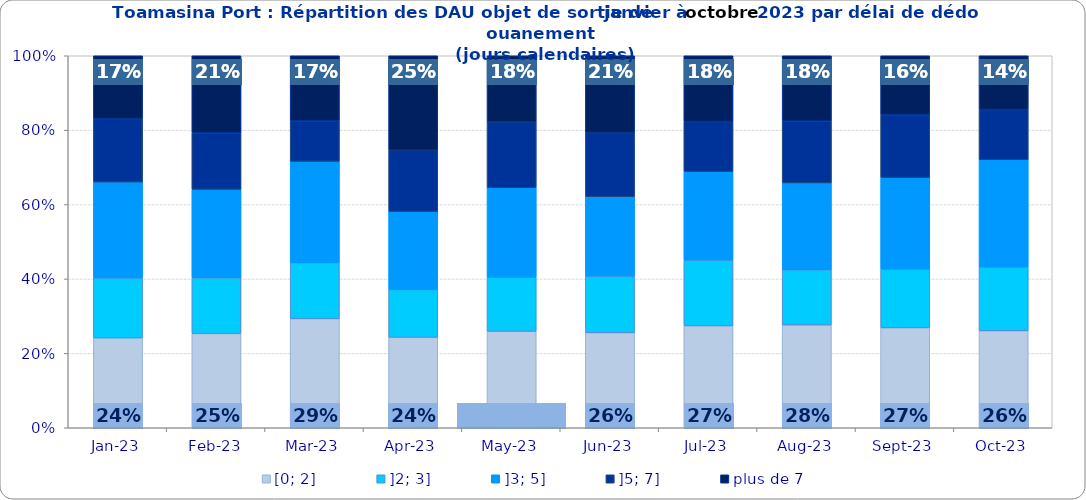
| Category | [0; 2] | ]2; 3] | ]3; 5] | ]5; 7] | plus de 7 |
|---|---|---|---|---|---|
| 2023-01-01 | 0.242 | 0.161 | 0.258 | 0.171 | 0.169 |
| 2023-02-01 | 0.253 | 0.15 | 0.238 | 0.152 | 0.207 |
| 2023-03-01 | 0.293 | 0.151 | 0.272 | 0.109 | 0.175 |
| 2023-04-01 | 0.243 | 0.129 | 0.209 | 0.165 | 0.254 |
| 2023-05-01 | 0.259 | 0.146 | 0.24 | 0.178 | 0.177 |
| 2023-06-01 | 0.255 | 0.152 | 0.213 | 0.173 | 0.206 |
| 2023-07-01 | 0.274 | 0.177 | 0.238 | 0.135 | 0.177 |
| 2023-08-01 | 0.276 | 0.148 | 0.233 | 0.166 | 0.175 |
| 2023-09-01 | 0.269 | 0.158 | 0.246 | 0.169 | 0.158 |
| 2023-10-01 | 0.261 | 0.171 | 0.289 | 0.135 | 0.144 |